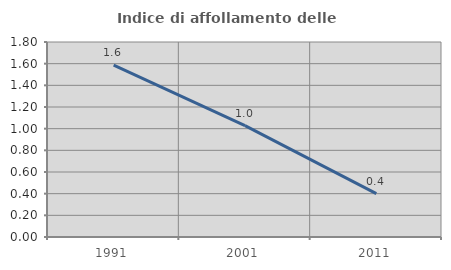
| Category | Indice di affollamento delle abitazioni  |
|---|---|
| 1991.0 | 1.587 |
| 2001.0 | 1.029 |
| 2011.0 | 0.4 |